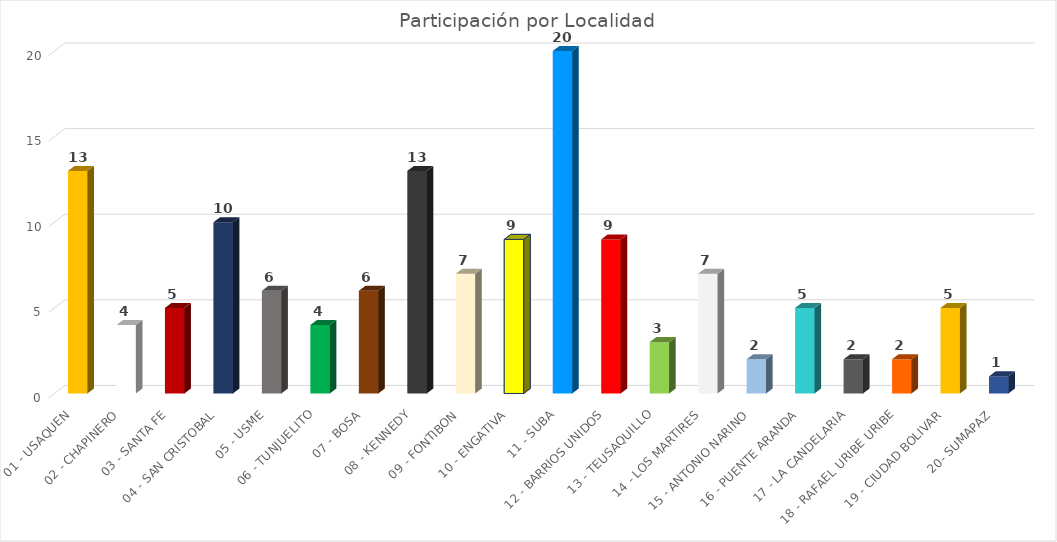
| Category | Peticiones |
|---|---|
| 01 - USAQUEN | 13 |
| 02 - CHAPINERO | 4 |
| 03 - SANTA FE | 5 |
| 04 - SAN CRISTOBAL | 10 |
| 05 - USME | 6 |
| 06 - TUNJUELITO | 4 |
| 07 - BOSA | 6 |
| 08 - KENNEDY | 13 |
| 09 - FONTIBON | 7 |
| 10 - ENGATIVA | 9 |
| 11 - SUBA | 20 |
| 12 - BARRIOS UNIDOS | 9 |
| 13 - TEUSAQUILLO | 3 |
| 14 - LOS MARTIRES | 7 |
| 15 - ANTONIO NARINO | 2 |
| 16 - PUENTE ARANDA | 5 |
| 17 - LA CANDELARIA | 2 |
| 18 - RAFAEL URIBE URIBE | 2 |
| 19 - CIUDAD BOLIVAR | 5 |
| 20- SUMAPAZ | 1 |